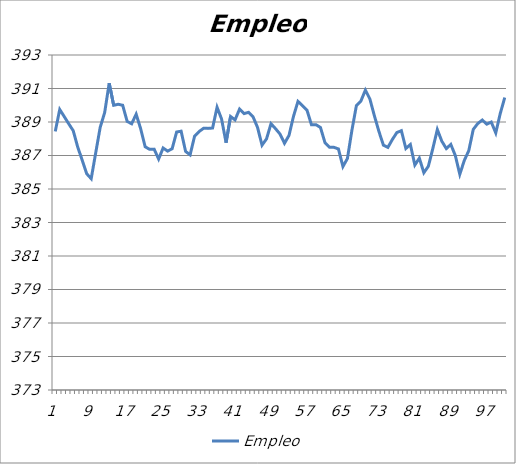
| Category | Empleo |
|---|---|
| 0 | 388.438 |
| 1 | 389.747 |
| 2 | 389.324 |
| 3 | 388.894 |
| 4 | 388.48 |
| 5 | 387.502 |
| 6 | 386.722 |
| 7 | 385.911 |
| 8 | 385.615 |
| 9 | 387.158 |
| 10 | 388.682 |
| 11 | 389.573 |
| 12 | 391.317 |
| 13 | 389.998 |
| 14 | 390.059 |
| 15 | 390 |
| 16 | 389.033 |
| 17 | 388.896 |
| 18 | 389.466 |
| 19 | 388.601 |
| 20 | 387.522 |
| 21 | 387.367 |
| 22 | 387.379 |
| 23 | 386.788 |
| 24 | 387.448 |
| 25 | 387.262 |
| 26 | 387.402 |
| 27 | 388.402 |
| 28 | 388.452 |
| 29 | 387.243 |
| 30 | 387.038 |
| 31 | 388.156 |
| 32 | 388.429 |
| 33 | 388.627 |
| 34 | 388.618 |
| 35 | 388.639 |
| 36 | 389.88 |
| 37 | 389.181 |
| 38 | 387.766 |
| 39 | 389.33 |
| 40 | 389.125 |
| 41 | 389.771 |
| 42 | 389.5 |
| 43 | 389.577 |
| 44 | 389.31 |
| 45 | 388.679 |
| 46 | 387.615 |
| 47 | 387.992 |
| 48 | 388.897 |
| 49 | 388.602 |
| 50 | 388.283 |
| 51 | 387.73 |
| 52 | 388.196 |
| 53 | 389.337 |
| 54 | 390.232 |
| 55 | 389.972 |
| 56 | 389.711 |
| 57 | 388.834 |
| 58 | 388.839 |
| 59 | 388.673 |
| 60 | 387.772 |
| 61 | 387.489 |
| 62 | 387.488 |
| 63 | 387.391 |
| 64 | 386.339 |
| 65 | 386.821 |
| 66 | 388.51 |
| 67 | 389.984 |
| 68 | 390.254 |
| 69 | 390.907 |
| 70 | 390.37 |
| 71 | 389.369 |
| 72 | 388.442 |
| 73 | 387.617 |
| 74 | 387.484 |
| 75 | 387.957 |
| 76 | 388.371 |
| 77 | 388.481 |
| 78 | 387.419 |
| 79 | 387.656 |
| 80 | 386.431 |
| 81 | 386.843 |
| 82 | 385.972 |
| 83 | 386.354 |
| 84 | 387.418 |
| 85 | 388.549 |
| 86 | 387.852 |
| 87 | 387.412 |
| 88 | 387.661 |
| 89 | 387 |
| 90 | 385.877 |
| 91 | 386.703 |
| 92 | 387.293 |
| 93 | 388.562 |
| 94 | 388.908 |
| 95 | 389.117 |
| 96 | 388.871 |
| 97 | 388.998 |
| 98 | 388.349 |
| 99 | 389.508 |
| 100 | 390.46 |